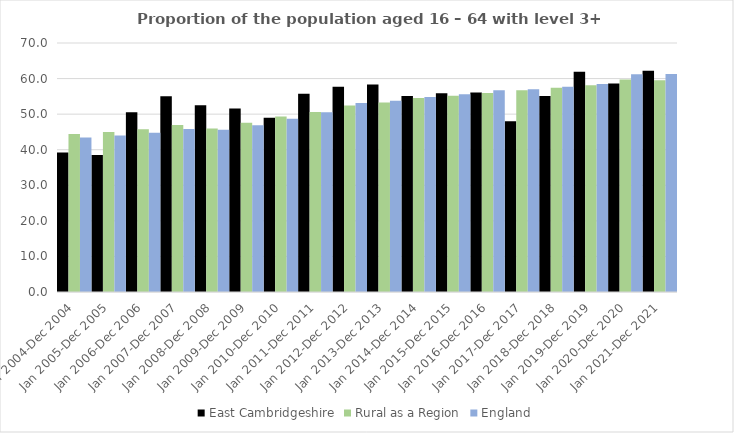
| Category | East Cambridgeshire | Rural as a Region | England |
|---|---|---|---|
| Jan 2004-Dec 2004 | 39.2 | 44.405 | 43.4 |
| Jan 2005-Dec 2005 | 38.5 | 44.973 | 44 |
| Jan 2006-Dec 2006 | 50.5 | 45.774 | 44.8 |
| Jan 2007-Dec 2007 | 55 | 46.968 | 45.8 |
| Jan 2008-Dec 2008 | 52.5 | 45.964 | 45.6 |
| Jan 2009-Dec 2009 | 51.6 | 47.59 | 46.9 |
| Jan 2010-Dec 2010 | 49 | 49.362 | 48.7 |
| Jan 2011-Dec 2011 | 55.7 | 50.602 | 50.5 |
| Jan 2012-Dec 2012 | 57.7 | 52.439 | 53.1 |
| Jan 2013-Dec 2013 | 58.3 | 53.276 | 53.8 |
| Jan 2014-Dec 2014 | 55.1 | 54.57 | 54.8 |
| Jan 2015-Dec 2015 | 55.9 | 55.16 | 55.6 |
| Jan 2016-Dec 2016 | 56.1 | 55.941 | 56.7 |
| Jan 2017-Dec 2017 | 48 | 56.689 | 57 |
| Jan 2018-Dec 2018 | 55.1 | 57.389 | 57.7 |
| Jan 2019-Dec 2019 | 61.9 | 58.147 | 58.5 |
| Jan 2020-Dec 2020 | 58.6 | 59.771 | 61.2 |
| Jan 2021-Dec 2021 | 62.2 | 59.54 | 61.3 |